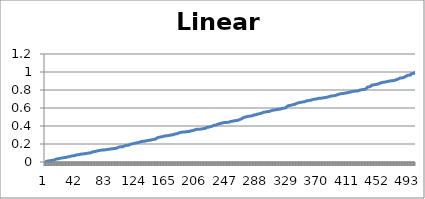
| Category | Linear |
|---|---|
| 0 | 0 |
| 1 | 0.001 |
| 2 | 0.009 |
| 3 | 0.011 |
| 4 | 0.012 |
| 5 | 0.012 |
| 6 | 0.014 |
| 7 | 0.016 |
| 8 | 0.017 |
| 9 | 0.018 |
| 10 | 0.02 |
| 11 | 0.021 |
| 12 | 0.021 |
| 13 | 0.032 |
| 14 | 0.032 |
| 15 | 0.032 |
| 16 | 0.033 |
| 17 | 0.037 |
| 18 | 0.037 |
| 19 | 0.038 |
| 20 | 0.041 |
| 21 | 0.042 |
| 22 | 0.045 |
| 23 | 0.046 |
| 24 | 0.046 |
| 25 | 0.046 |
| 26 | 0.05 |
| 27 | 0.051 |
| 28 | 0.051 |
| 29 | 0.054 |
| 30 | 0.057 |
| 31 | 0.057 |
| 32 | 0.058 |
| 33 | 0.06 |
| 34 | 0.064 |
| 35 | 0.065 |
| 36 | 0.068 |
| 37 | 0.068 |
| 38 | 0.069 |
| 39 | 0.072 |
| 40 | 0.073 |
| 41 | 0.078 |
| 42 | 0.079 |
| 43 | 0.08 |
| 44 | 0.08 |
| 45 | 0.082 |
| 46 | 0.083 |
| 47 | 0.087 |
| 48 | 0.088 |
| 49 | 0.089 |
| 50 | 0.089 |
| 51 | 0.09 |
| 52 | 0.091 |
| 53 | 0.092 |
| 54 | 0.093 |
| 55 | 0.095 |
| 56 | 0.096 |
| 57 | 0.096 |
| 58 | 0.099 |
| 59 | 0.099 |
| 60 | 0.1 |
| 61 | 0.1 |
| 62 | 0.105 |
| 63 | 0.107 |
| 64 | 0.113 |
| 65 | 0.114 |
| 66 | 0.115 |
| 67 | 0.116 |
| 68 | 0.119 |
| 69 | 0.119 |
| 70 | 0.124 |
| 71 | 0.125 |
| 72 | 0.126 |
| 73 | 0.129 |
| 74 | 0.13 |
| 75 | 0.13 |
| 76 | 0.132 |
| 77 | 0.133 |
| 78 | 0.133 |
| 79 | 0.133 |
| 80 | 0.135 |
| 81 | 0.136 |
| 82 | 0.136 |
| 83 | 0.137 |
| 84 | 0.14 |
| 85 | 0.141 |
| 86 | 0.142 |
| 87 | 0.144 |
| 88 | 0.144 |
| 89 | 0.147 |
| 90 | 0.147 |
| 91 | 0.148 |
| 92 | 0.148 |
| 93 | 0.15 |
| 94 | 0.15 |
| 95 | 0.15 |
| 96 | 0.154 |
| 97 | 0.159 |
| 98 | 0.162 |
| 99 | 0.165 |
| 100 | 0.168 |
| 101 | 0.168 |
| 102 | 0.168 |
| 103 | 0.169 |
| 104 | 0.169 |
| 105 | 0.17 |
| 106 | 0.177 |
| 107 | 0.178 |
| 108 | 0.182 |
| 109 | 0.185 |
| 110 | 0.186 |
| 111 | 0.186 |
| 112 | 0.186 |
| 113 | 0.189 |
| 114 | 0.196 |
| 115 | 0.199 |
| 116 | 0.2 |
| 117 | 0.201 |
| 118 | 0.202 |
| 119 | 0.207 |
| 120 | 0.207 |
| 121 | 0.208 |
| 122 | 0.211 |
| 123 | 0.212 |
| 124 | 0.214 |
| 125 | 0.215 |
| 126 | 0.218 |
| 127 | 0.219 |
| 128 | 0.225 |
| 129 | 0.225 |
| 130 | 0.228 |
| 131 | 0.229 |
| 132 | 0.229 |
| 133 | 0.23 |
| 134 | 0.232 |
| 135 | 0.232 |
| 136 | 0.236 |
| 137 | 0.238 |
| 138 | 0.238 |
| 139 | 0.239 |
| 140 | 0.241 |
| 141 | 0.242 |
| 142 | 0.244 |
| 143 | 0.246 |
| 144 | 0.247 |
| 145 | 0.251 |
| 146 | 0.252 |
| 147 | 0.252 |
| 148 | 0.253 |
| 149 | 0.26 |
| 150 | 0.264 |
| 151 | 0.268 |
| 152 | 0.272 |
| 153 | 0.276 |
| 154 | 0.276 |
| 155 | 0.277 |
| 156 | 0.279 |
| 157 | 0.281 |
| 158 | 0.282 |
| 159 | 0.283 |
| 160 | 0.287 |
| 161 | 0.287 |
| 162 | 0.29 |
| 163 | 0.291 |
| 164 | 0.291 |
| 165 | 0.294 |
| 166 | 0.295 |
| 167 | 0.297 |
| 168 | 0.297 |
| 169 | 0.298 |
| 170 | 0.301 |
| 171 | 0.303 |
| 172 | 0.303 |
| 173 | 0.304 |
| 174 | 0.309 |
| 175 | 0.313 |
| 176 | 0.313 |
| 177 | 0.315 |
| 178 | 0.315 |
| 179 | 0.319 |
| 180 | 0.324 |
| 181 | 0.327 |
| 182 | 0.329 |
| 183 | 0.33 |
| 184 | 0.332 |
| 185 | 0.332 |
| 186 | 0.332 |
| 187 | 0.332 |
| 188 | 0.333 |
| 189 | 0.336 |
| 190 | 0.337 |
| 191 | 0.337 |
| 192 | 0.338 |
| 193 | 0.339 |
| 194 | 0.339 |
| 195 | 0.345 |
| 196 | 0.347 |
| 197 | 0.347 |
| 198 | 0.348 |
| 199 | 0.349 |
| 200 | 0.352 |
| 201 | 0.356 |
| 202 | 0.359 |
| 203 | 0.361 |
| 204 | 0.363 |
| 205 | 0.363 |
| 206 | 0.364 |
| 207 | 0.364 |
| 208 | 0.365 |
| 209 | 0.365 |
| 210 | 0.366 |
| 211 | 0.367 |
| 212 | 0.369 |
| 213 | 0.372 |
| 214 | 0.372 |
| 215 | 0.373 |
| 216 | 0.375 |
| 217 | 0.382 |
| 218 | 0.386 |
| 219 | 0.387 |
| 220 | 0.387 |
| 221 | 0.387 |
| 222 | 0.393 |
| 223 | 0.393 |
| 224 | 0.396 |
| 225 | 0.399 |
| 226 | 0.404 |
| 227 | 0.406 |
| 228 | 0.409 |
| 229 | 0.41 |
| 230 | 0.41 |
| 231 | 0.416 |
| 232 | 0.418 |
| 233 | 0.424 |
| 234 | 0.424 |
| 235 | 0.425 |
| 236 | 0.428 |
| 237 | 0.429 |
| 238 | 0.431 |
| 239 | 0.433 |
| 240 | 0.437 |
| 241 | 0.437 |
| 242 | 0.439 |
| 243 | 0.439 |
| 244 | 0.44 |
| 245 | 0.44 |
| 246 | 0.441 |
| 247 | 0.443 |
| 248 | 0.443 |
| 249 | 0.447 |
| 250 | 0.451 |
| 251 | 0.453 |
| 252 | 0.453 |
| 253 | 0.455 |
| 254 | 0.456 |
| 255 | 0.458 |
| 256 | 0.459 |
| 257 | 0.46 |
| 258 | 0.461 |
| 259 | 0.462 |
| 260 | 0.464 |
| 261 | 0.467 |
| 262 | 0.473 |
| 263 | 0.477 |
| 264 | 0.478 |
| 265 | 0.482 |
| 266 | 0.488 |
| 267 | 0.492 |
| 268 | 0.496 |
| 269 | 0.5 |
| 270 | 0.501 |
| 271 | 0.502 |
| 272 | 0.504 |
| 273 | 0.505 |
| 274 | 0.509 |
| 275 | 0.509 |
| 276 | 0.51 |
| 277 | 0.51 |
| 278 | 0.512 |
| 279 | 0.515 |
| 280 | 0.517 |
| 281 | 0.518 |
| 282 | 0.524 |
| 283 | 0.525 |
| 284 | 0.526 |
| 285 | 0.528 |
| 286 | 0.532 |
| 287 | 0.533 |
| 288 | 0.535 |
| 289 | 0.537 |
| 290 | 0.539 |
| 291 | 0.545 |
| 292 | 0.545 |
| 293 | 0.546 |
| 294 | 0.552 |
| 295 | 0.555 |
| 296 | 0.555 |
| 297 | 0.557 |
| 298 | 0.558 |
| 299 | 0.558 |
| 300 | 0.56 |
| 301 | 0.561 |
| 302 | 0.562 |
| 303 | 0.568 |
| 304 | 0.569 |
| 305 | 0.571 |
| 306 | 0.574 |
| 307 | 0.578 |
| 308 | 0.578 |
| 309 | 0.578 |
| 310 | 0.579 |
| 311 | 0.58 |
| 312 | 0.584 |
| 313 | 0.585 |
| 314 | 0.585 |
| 315 | 0.585 |
| 316 | 0.586 |
| 317 | 0.588 |
| 318 | 0.592 |
| 319 | 0.595 |
| 320 | 0.598 |
| 321 | 0.598 |
| 322 | 0.598 |
| 323 | 0.6 |
| 324 | 0.602 |
| 325 | 0.613 |
| 326 | 0.62 |
| 327 | 0.625 |
| 328 | 0.627 |
| 329 | 0.627 |
| 330 | 0.629 |
| 331 | 0.633 |
| 332 | 0.634 |
| 333 | 0.635 |
| 334 | 0.638 |
| 335 | 0.64 |
| 336 | 0.641 |
| 337 | 0.642 |
| 338 | 0.648 |
| 339 | 0.648 |
| 340 | 0.656 |
| 341 | 0.658 |
| 342 | 0.66 |
| 343 | 0.66 |
| 344 | 0.662 |
| 345 | 0.665 |
| 346 | 0.666 |
| 347 | 0.667 |
| 348 | 0.668 |
| 349 | 0.67 |
| 350 | 0.671 |
| 351 | 0.674 |
| 352 | 0.68 |
| 353 | 0.681 |
| 354 | 0.682 |
| 355 | 0.684 |
| 356 | 0.684 |
| 357 | 0.686 |
| 358 | 0.687 |
| 359 | 0.689 |
| 360 | 0.693 |
| 361 | 0.696 |
| 362 | 0.698 |
| 363 | 0.699 |
| 364 | 0.7 |
| 365 | 0.7 |
| 366 | 0.701 |
| 367 | 0.706 |
| 368 | 0.707 |
| 369 | 0.708 |
| 370 | 0.708 |
| 371 | 0.709 |
| 372 | 0.709 |
| 373 | 0.711 |
| 374 | 0.712 |
| 375 | 0.713 |
| 376 | 0.715 |
| 377 | 0.716 |
| 378 | 0.717 |
| 379 | 0.719 |
| 380 | 0.721 |
| 381 | 0.722 |
| 382 | 0.725 |
| 383 | 0.732 |
| 384 | 0.732 |
| 385 | 0.733 |
| 386 | 0.733 |
| 387 | 0.734 |
| 388 | 0.736 |
| 389 | 0.736 |
| 390 | 0.738 |
| 391 | 0.741 |
| 392 | 0.743 |
| 393 | 0.745 |
| 394 | 0.748 |
| 395 | 0.751 |
| 396 | 0.755 |
| 397 | 0.758 |
| 398 | 0.758 |
| 399 | 0.759 |
| 400 | 0.761 |
| 401 | 0.761 |
| 402 | 0.762 |
| 403 | 0.763 |
| 404 | 0.765 |
| 405 | 0.766 |
| 406 | 0.767 |
| 407 | 0.772 |
| 408 | 0.773 |
| 409 | 0.773 |
| 410 | 0.775 |
| 411 | 0.777 |
| 412 | 0.78 |
| 413 | 0.783 |
| 414 | 0.784 |
| 415 | 0.785 |
| 416 | 0.786 |
| 417 | 0.786 |
| 418 | 0.788 |
| 419 | 0.788 |
| 420 | 0.789 |
| 421 | 0.791 |
| 422 | 0.792 |
| 423 | 0.797 |
| 424 | 0.799 |
| 425 | 0.802 |
| 426 | 0.803 |
| 427 | 0.804 |
| 428 | 0.805 |
| 429 | 0.805 |
| 430 | 0.806 |
| 431 | 0.812 |
| 432 | 0.813 |
| 433 | 0.815 |
| 434 | 0.832 |
| 435 | 0.833 |
| 436 | 0.835 |
| 437 | 0.835 |
| 438 | 0.839 |
| 439 | 0.849 |
| 440 | 0.855 |
| 441 | 0.855 |
| 442 | 0.856 |
| 443 | 0.858 |
| 444 | 0.86 |
| 445 | 0.861 |
| 446 | 0.863 |
| 447 | 0.863 |
| 448 | 0.864 |
| 449 | 0.866 |
| 450 | 0.873 |
| 451 | 0.876 |
| 452 | 0.878 |
| 453 | 0.879 |
| 454 | 0.884 |
| 455 | 0.886 |
| 456 | 0.886 |
| 457 | 0.887 |
| 458 | 0.888 |
| 459 | 0.89 |
| 460 | 0.893 |
| 461 | 0.894 |
| 462 | 0.896 |
| 463 | 0.899 |
| 464 | 0.9 |
| 465 | 0.901 |
| 466 | 0.902 |
| 467 | 0.903 |
| 468 | 0.903 |
| 469 | 0.904 |
| 470 | 0.906 |
| 471 | 0.907 |
| 472 | 0.91 |
| 473 | 0.915 |
| 474 | 0.919 |
| 475 | 0.922 |
| 476 | 0.922 |
| 477 | 0.929 |
| 478 | 0.933 |
| 479 | 0.933 |
| 480 | 0.934 |
| 481 | 0.934 |
| 482 | 0.938 |
| 483 | 0.942 |
| 484 | 0.944 |
| 485 | 0.952 |
| 486 | 0.952 |
| 487 | 0.957 |
| 488 | 0.962 |
| 489 | 0.963 |
| 490 | 0.965 |
| 491 | 0.966 |
| 492 | 0.967 |
| 493 | 0.979 |
| 494 | 0.982 |
| 495 | 0.983 |
| 496 | 0.985 |
| 497 | 0.987 |
| 498 | 0.996 |
| 499 | 0.998 |